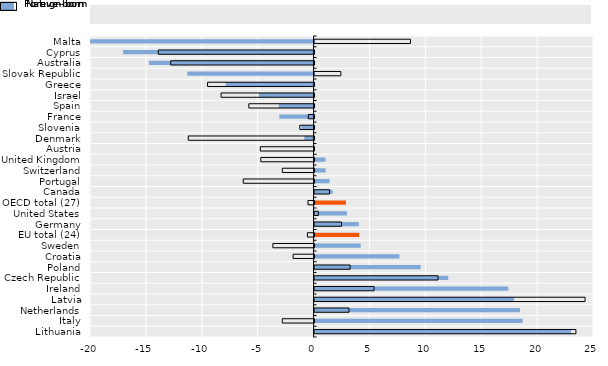
| Category | Foreign-born | Native-born |
|---|---|---|
| Malta | -25.318 | 8.582 |
| Cyprus | -17.045 | -13.935 |
| Australia | -14.729 | -12.822 |
| Slovak Republic | -11.289 | 2.351 |
| Greece | -7.863 | -9.526 |
| Israel | -4.89 | -8.32 |
| Spain | -3.119 | -5.835 |
| France | -3.064 | -0.517 |
| Slovenia | -1.084 | -1.277 |
| Denmark | -0.821 | -11.251 |
| Austria | 0.009 | -4.808 |
| United Kingdom | 0.981 | -4.763 |
| Switzerland | 0.986 | -2.838 |
| Portugal | 1.345 | -6.335 |
| Canada | 1.617 | 1.339 |
| OECD total (27) | 2.812 | -0.544 |
| United States | 2.9 | 0.34 |
| Germany | 3.957 | 2.415 |
| EU total (24) | 3.989 | -0.598 |
| Sweden | 4.128 | -3.684 |
| Croatia | 7.592 | -1.872 |
| Poland | 9.495 | 3.184 |
| Czech Republic | 11.961 | 11.047 |
| Ireland | 17.334 | 5.324 |
| Latvia | 17.853 | 24.202 |
| Netherlands | 18.371 | 3.081 |
| Italy | 18.607 | -2.84 |
| Lithuania | 22.96 | 23.381 |